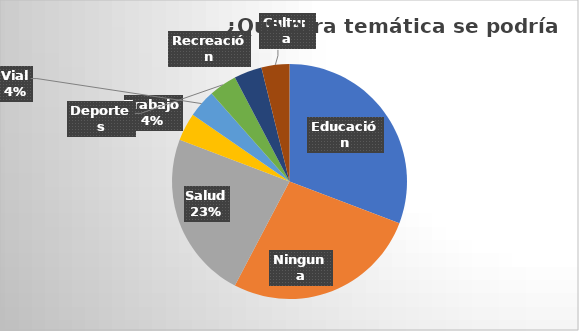
| Category | Series 0 |
|---|---|
| Educación | 8 |
| Ninguna | 7 |
| Salud | 6 |
| Trabajo | 1 |
| Vial | 1 |
| Deportes | 1 |
| Recreación | 1 |
| Cultura | 1 |